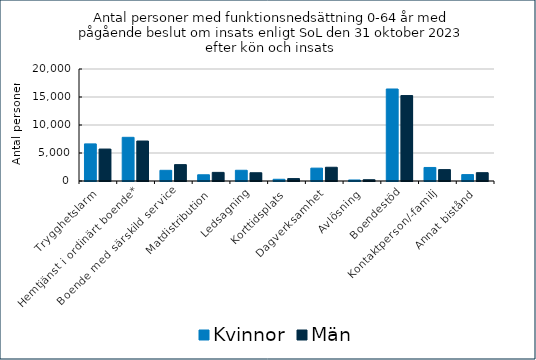
| Category | Kvinnor | Män |
|---|---|---|
| Trygghetslarm | 6626 | 5704 |
| Hemtjänst i ordinärt boende* | 7799 | 7139 |
| Boende med särskild service | 1907 | 2926 |
| Matdistribution | 1113 | 1538 |
| Ledsagning | 1916 | 1474 |
| Korttidsplats | 309 | 430 |
| Dagverksamhet | 2298 | 2453 |
| Avlösning | 184 | 231 |
| Boendestöd | 16429 | 15259 |
| Kontaktperson/-familj | 2417 | 2035 |
| Annat bistånd | 1142 | 1486 |